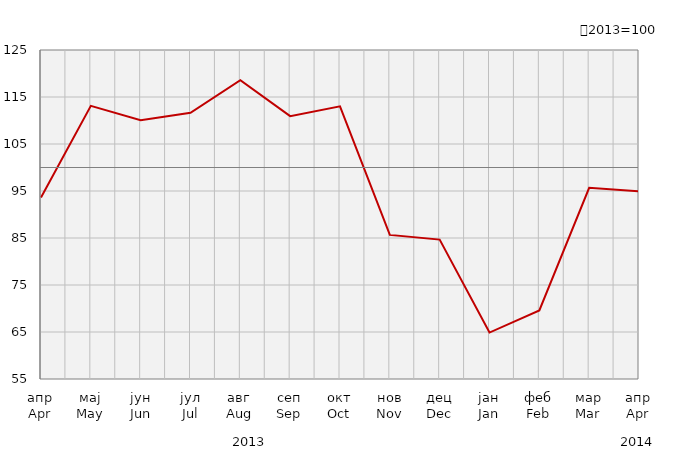
| Category | Индекси ноћења туриста
Tourist night indices |
|---|---|
| апр
Apr | 93.597 |
| мај
May | 113.125 |
| јун
Jun | 110.07 |
| јул
Jul | 111.646 |
| авг
Aug | 118.578 |
| сеп
Sep | 110.922 |
| окт
Oct | 113.026 |
| нов
Nov | 85.665 |
| дец
Dec | 84.657 |
| јан
Jan | 64.882 |
| феб
Feb | 69.586 |
| мар
Mar | 95.676 |
| апр
Apr | 94.927 |